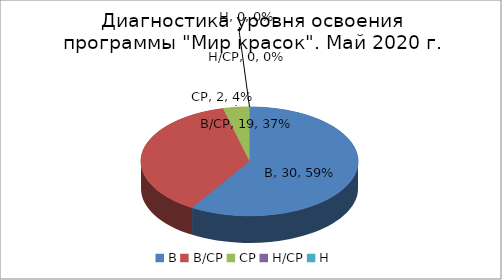
| Category | Май 2020 |
|---|---|
| В | 30 |
| В/СР | 19 |
| СР | 2 |
| Н/СР | 0 |
| Н | 0 |